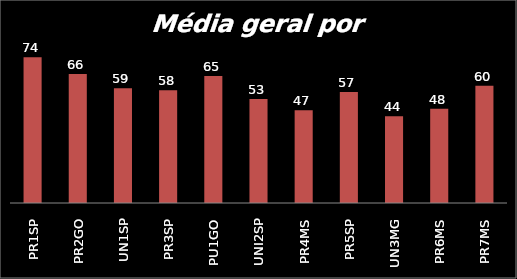
| Category | Series 0 |
|---|---|
| PR1SP | 74.25 |
| PR2GO | 65.75 |
| UN1SP | 58.5 |
| PR3SP | 57.5 |
| PU1GO | 64.75 |
| UNI2SP | 53 |
| PR4MS | 47.25 |
| PR5SP | 56.5 |
| UN3MG | 44.25 |
| PR6MS | 48 |
| PR7MS | 59.75 |